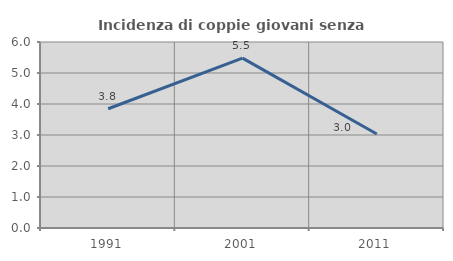
| Category | Incidenza di coppie giovani senza figli |
|---|---|
| 1991.0 | 3.846 |
| 2001.0 | 5.479 |
| 2011.0 | 3.03 |